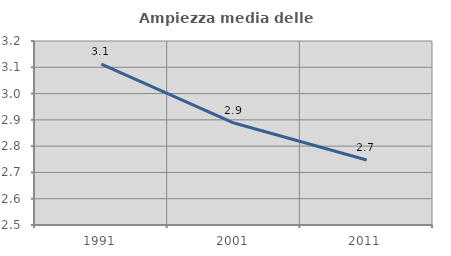
| Category | Ampiezza media delle famiglie |
|---|---|
| 1991.0 | 3.112 |
| 2001.0 | 2.888 |
| 2011.0 | 2.747 |